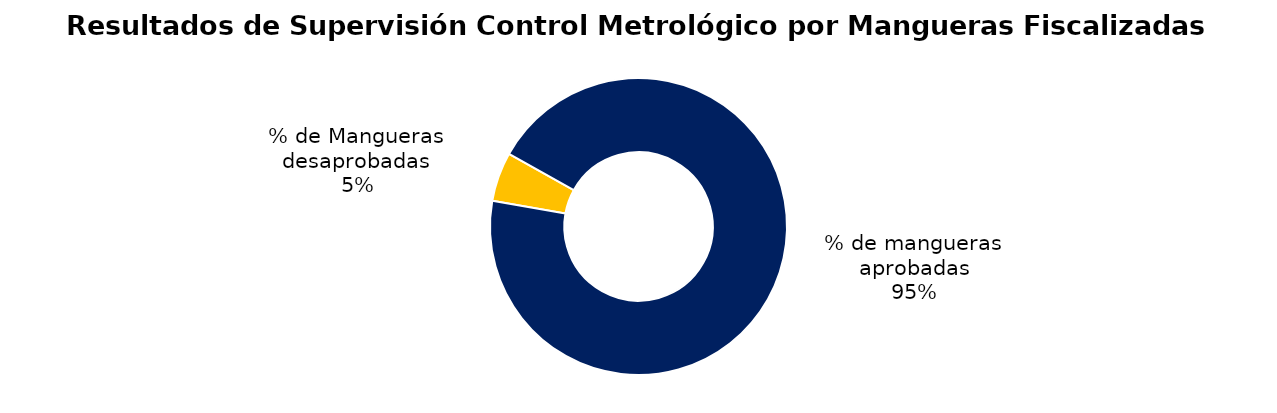
| Category | Series 0 |
|---|---|
| % de Mangueras desaprobadas | 70 |
| % de mangueras aprobadas | 1234 |